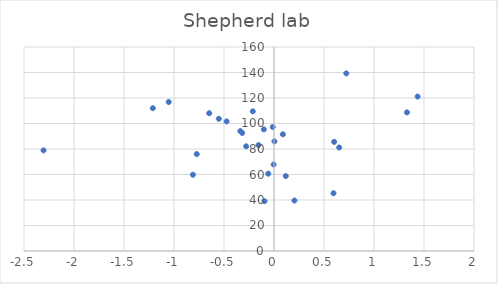
| Category | Series 0 |
|---|---|
| -0.057495 | 60.638 |
| -2.304472 | 78.914 |
| -0.154541 | 83.043 |
| 0.594941 | 45.295 |
| 0.204632 | 39.576 |
| -0.094986 | 39.096 |
| -0.212092 | 109.553 |
| -1.052822 | 116.88 |
| 0.08861 | 91.514 |
| -0.278246 | 82.118 |
| 0.004173 | 85.997 |
| 0.601421 | 85.593 |
| 1.436203 | 121.12 |
| 1.32947 | 108.728 |
| -0.004148 | 67.836 |
| 0.722918 | 139.298 |
| -0.810685 | 59.801 |
| 0.117816 | 58.764 |
| -0.101765 | 95.408 |
| -0.647895 | 108.079 |
| -0.551557 | 103.672 |
| -0.474157 | 101.606 |
| 0.651882 | 81.148 |
| -1.211541 | 112 |
| -0.336803 | 94.008 |
| -0.318532 | 92.584 |
| -0.772422 | 76.033 |
| -0.012498 | 97.237 |